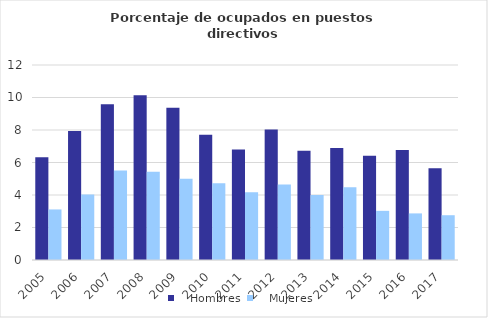
| Category |    Hombres |    Mujeres |
|---|---|---|
| 2005.0 | 6.325 | 3.112 |
| 2006.0 | 7.931 | 4.029 |
| 2007.0 | 9.589 | 5.502 |
| 2008.0 | 10.145 | 5.426 |
| 2009.0 | 9.372 | 4.998 |
| 2010.0 | 7.705 | 4.719 |
| 2011.0 | 6.806 | 4.176 |
| 2012.0 | 8.026 | 4.644 |
| 2013.0 | 6.729 | 4.002 |
| 2014.0 | 6.886 | 4.472 |
| 2015.0 | 6.413 | 3.025 |
| 2016.0 | 6.772 | 2.867 |
| 2017.0 | 5.653 | 2.756 |